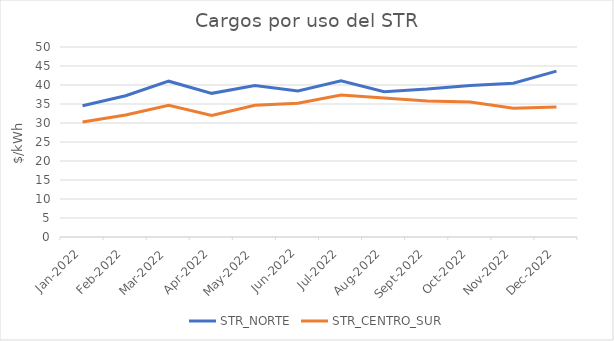
| Category | STR_NORTE | STR_CENTRO_SUR |
|---|---|---|
| 2022-01-01 | 34.52 | 30.239 |
| 2022-02-01 | 37.162 | 32.09 |
| 2022-03-01 | 41.005 | 34.635 |
| 2022-04-01 | 37.803 | 31.986 |
| 2022-05-01 | 39.894 | 34.687 |
| 2022-06-01 | 38.415 | 35.208 |
| 2022-07-01 | 41.106 | 37.369 |
| 2022-08-01 | 38.246 | 36.552 |
| 2022-09-01 | 38.919 | 35.801 |
| 2022-10-01 | 39.891 | 35.538 |
| 2022-11-01 | 40.468 | 33.912 |
| 2022-12-01 | 43.639 | 34.224 |